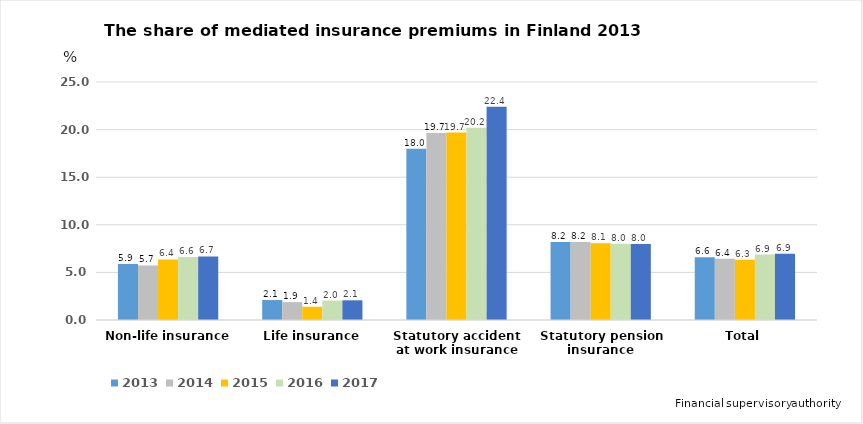
| Category | 2013 | 2014 | 2015 | 2016 | 2017 |
|---|---|---|---|---|---|
| Non-life insurance | 5.882 | 5.737 | 6.356 | 6.621 | 6.681 |
| Life insurance | 2.097 | 1.88 | 1.39 | 2.047 | 2.067 |
| Statutory accident at work insurance | 17.98 | 19.654 | 19.692 | 20.194 | 22.408 |
| Statutory pension insurance | 8.204 | 8.203 | 8.075 | 8.016 | 7.982 |
| Total | 6.584 | 6.436 | 6.337 | 6.875 | 6.948 |